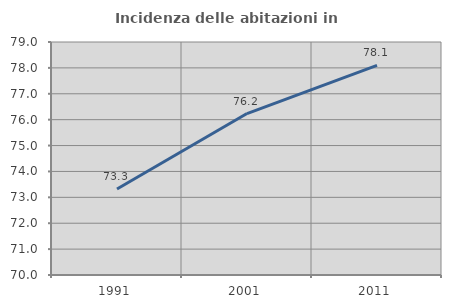
| Category | Incidenza delle abitazioni in proprietà  |
|---|---|
| 1991.0 | 73.32 |
| 2001.0 | 76.236 |
| 2011.0 | 78.098 |